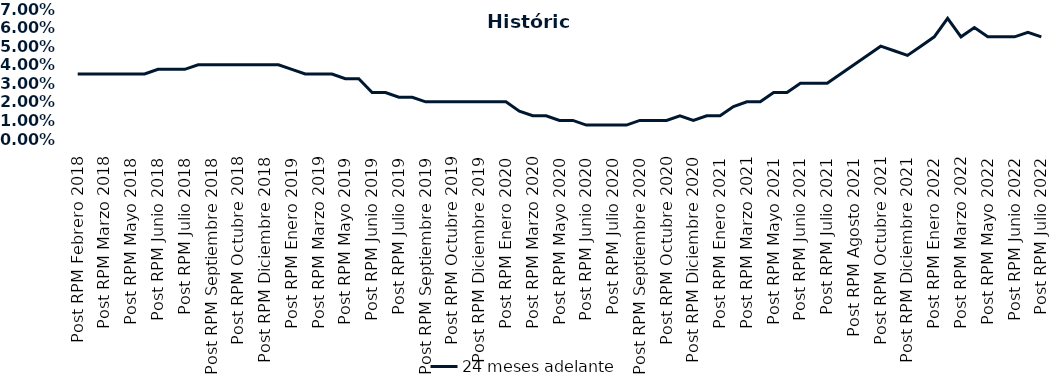
| Category | 24 meses adelante  |
|---|---|
| Post RPM Febrero 2018 | 0.035 |
| Pre RPM Marzo 2018 | 0.035 |
| Post RPM Marzo 2018 | 0.035 |
| Pre RPM Mayo 2018 | 0.035 |
| Post RPM Mayo 2018 | 0.035 |
| Pre RPM Junio 2018 | 0.035 |
| Post RPM Junio 2018 | 0.038 |
| Pre RPM Julio 2018 | 0.038 |
| Post RPM Julio 2018 | 0.038 |
| Pre RPM Septiembre 2018 | 0.04 |
| Post RPM Septiembre 2018 | 0.04 |
| Pre RPM Octubre 2018 | 0.04 |
| Post RPM Octubre 2018 | 0.04 |
| Pre RPM Diciembre 2018 | 0.04 |
| Post RPM Diciembre 2018 | 0.04 |
| Pre RPM Enero 2019 | 0.04 |
| Post RPM Enero 2019 | 0.038 |
| Pre RPM Marzo 2019 | 0.035 |
| Post RPM Marzo 2019 | 0.035 |
| Pre RPM Mayo 2019 | 0.035 |
| Post RPM Mayo 2019 | 0.032 |
| Pre RPM Junio 2019 | 0.032 |
| Post RPM Junio 2019 | 0.025 |
| Pre RPM Julio 2019 | 0.025 |
| Post RPM Julio 2019 | 0.022 |
| Pre RPM Septiembre 2019 | 0.022 |
| Post RPM Septiembre 2019 | 0.02 |
| Pre RPM Octubre 2019 | 0.02 |
| Post RPM Octubre 2019 | 0.02 |
| Pre RPM Diciembre 2019 | 0.02 |
| Post RPM Diciembre 2019 | 0.02 |
| Pre RPM Enero 2020 | 0.02 |
| Post RPM Enero 2020 | 0.02 |
| Pre RPM Marzo 2020 | 0.015 |
| Post RPM Marzo 2020 | 0.012 |
| Pre RPM Mayo 2020 | 0.012 |
| Post RPM Mayo 2020 | 0.01 |
| Pre RPM Junio 2020 | 0.01 |
| Post RPM Junio 2020 | 0.008 |
| Pre RPM Julio 2020 | 0.008 |
| Post RPM Julio 2020 | 0.008 |
| Pre RPM Septiembre 2020 | 0.008 |
| Post RPM Septiembre 2020 | 0.01 |
| Pre RPM Octubre 2020 | 0.01 |
| Post RPM Octubre 2020 | 0.01 |
| Pre RPM Diciembre 2020 | 0.012 |
| Post RPM Diciembre 2020 | 0.01 |
| Pre RPM Enero 2021 | 0.012 |
| Post RPM Enero 2021 | 0.012 |
| Pre RPM Marzo 2021 | 0.018 |
| Post RPM Marzo 2021 | 0.02 |
| Pre RPM Mayo 2021 | 0.02 |
| Post RPM Mayo 2021 | 0.025 |
| Pre RPM Junio 2021 | 0.025 |
| Post RPM Junio 2021 | 0.03 |
| Pre RPM Julio 2021 | 0.03 |
| Post RPM Julio 2021 | 0.03 |
| Pre RPM Agosto 2021 | 0.035 |
| Post RPM Agosto 2021 | 0.04 |
| Pre RPM Octubre 2021 | 0.045 |
| Post RPM Octubre 2021 | 0.05 |
| Pre RPM Diciembre 2021 | 0.048 |
| Post RPM Diciembre 2021 | 0.045 |
| Pre RPM Enero 2022 | 0.05 |
| Post RPM Enero 2022 | 0.055 |
| Pre RPM Marzo 2022 | 0.065 |
| Post RPM Marzo 2022 | 0.055 |
| Pre RPM Mayo 2022 | 0.06 |
| Post RPM Mayo 2022 | 0.055 |
| Pre RPM Junio 2022 | 0.055 |
| Post RPM Junio 2022 | 0.055 |
| Pre RPM Julio 2022 | 0.058 |
| Post RPM Julio 2022 | 0.055 |